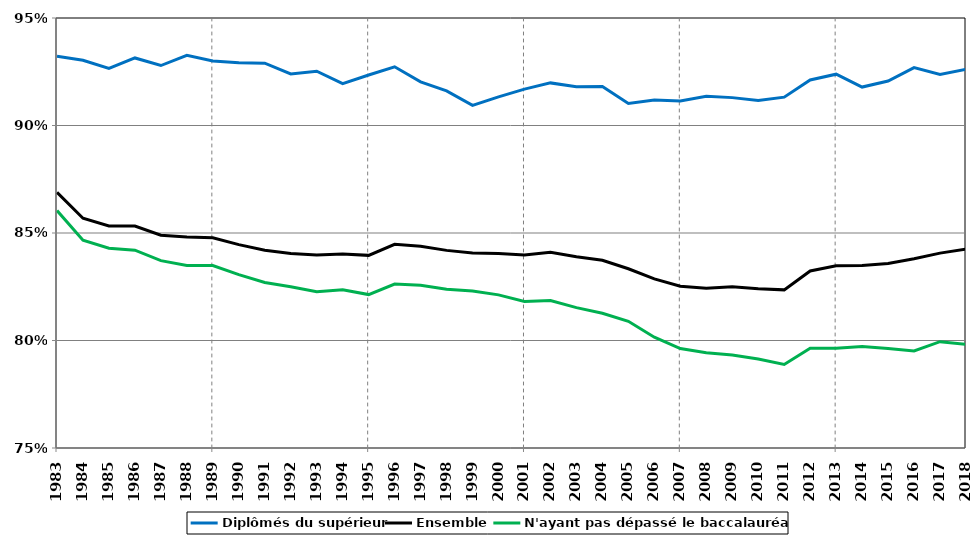
| Category | Diplômés du supérieur | Ensemble | N'ayant pas dépassé le baccalauréat* |
|---|---|---|---|
| 1983.0 | 0.932 | 0.869 | 0.86 |
| 1984.0 | 0.93 | 0.857 | 0.847 |
| 1985.0 | 0.927 | 0.853 | 0.843 |
| 1986.0 | 0.931 | 0.853 | 0.842 |
| 1987.0 | 0.928 | 0.849 | 0.837 |
| 1988.0 | 0.933 | 0.848 | 0.835 |
| 1989.0 | 0.93 | 0.848 | 0.835 |
| 1990.0 | 0.929 | 0.845 | 0.831 |
| 1991.0 | 0.929 | 0.842 | 0.827 |
| 1992.0 | 0.924 | 0.84 | 0.825 |
| 1993.0 | 0.925 | 0.84 | 0.823 |
| 1994.0 | 0.919 | 0.84 | 0.824 |
| 1995.0 | 0.924 | 0.84 | 0.821 |
| 1996.0 | 0.927 | 0.845 | 0.826 |
| 1997.0 | 0.92 | 0.844 | 0.826 |
| 1998.0 | 0.916 | 0.842 | 0.824 |
| 1999.0 | 0.909 | 0.841 | 0.823 |
| 2000.0 | 0.913 | 0.841 | 0.821 |
| 2001.0 | 0.917 | 0.84 | 0.818 |
| 2002.0 | 0.92 | 0.841 | 0.819 |
| 2003.0 | 0.918 | 0.839 | 0.815 |
| 2004.0 | 0.918 | 0.837 | 0.813 |
| 2005.0 | 0.91 | 0.833 | 0.809 |
| 2006.0 | 0.912 | 0.829 | 0.802 |
| 2007.0 | 0.911 | 0.825 | 0.796 |
| 2008.0 | 0.914 | 0.824 | 0.794 |
| 2009.0 | 0.913 | 0.825 | 0.793 |
| 2010.0 | 0.912 | 0.824 | 0.791 |
| 2011.0 | 0.913 | 0.824 | 0.789 |
| 2012.0 | 0.921 | 0.832 | 0.796 |
| 2013.0 | 0.924 | 0.835 | 0.796 |
| 2014.0 | 0.918 | 0.835 | 0.797 |
| 2015.0 | 0.921 | 0.836 | 0.796 |
| 2016.0 | 0.927 | 0.838 | 0.795 |
| 2017.0 | 0.924 | 0.841 | 0.799 |
| 2018.0 | 0.926 | 0.843 | 0.798 |